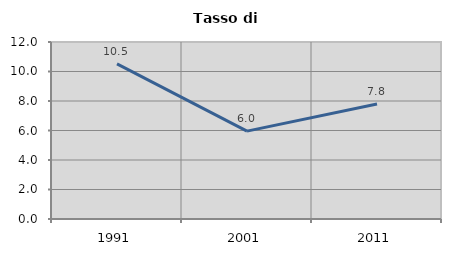
| Category | Tasso di disoccupazione   |
|---|---|
| 1991.0 | 10.513 |
| 2001.0 | 5.958 |
| 2011.0 | 7.802 |